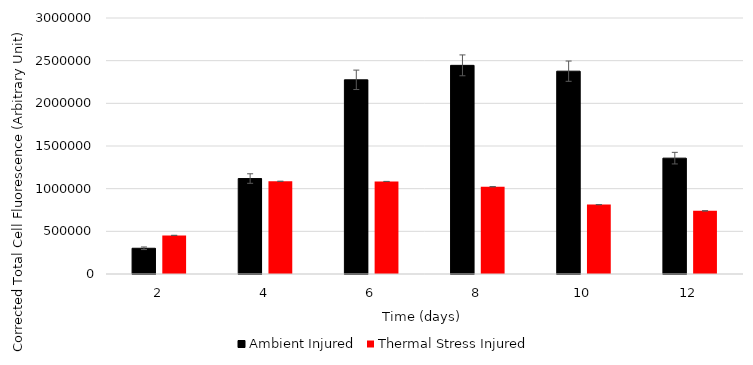
| Category | Ambient Injured | Thermal Stress Injured  |
|---|---|---|
| 0 | 301634 | 452502 |
| 1 | 1118526 | 1086128 |
| 2 | 2275598 | 1084681 |
| 3 | 2445177 | 1023133 |
| 4 | 2376826 | 813137 |
| 5 | 1357605 | 739983 |